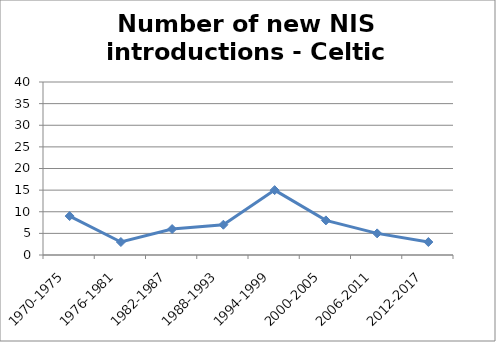
| Category | Number of new NIS introductions - Celtic Seas |
|---|---|
| 1970-1975 | 9 |
| 1976-1981 | 3 |
| 1982-1987 | 6 |
| 1988-1993 | 7 |
| 1994-1999 | 15 |
| 2000-2005 | 8 |
| 2006-2011 | 5 |
| 2012-2017 | 3 |